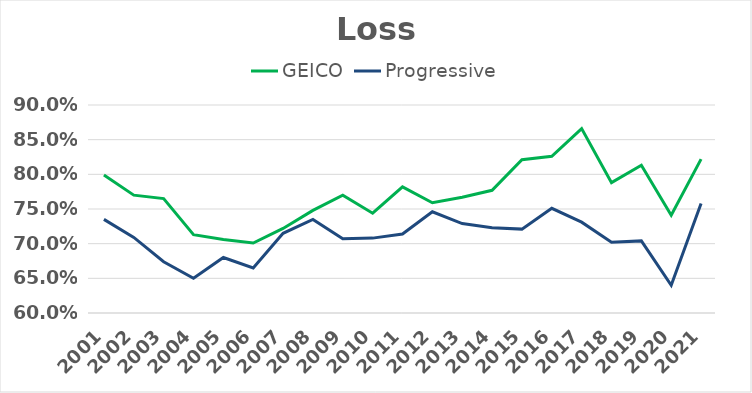
| Category | GEICO | Progressive |
|---|---|---|
| 2001.0 | 0.799 | 0.735 |
| 2002.0 | 0.77 | 0.709 |
| 2003.0 | 0.765 | 0.674 |
| 2004.0 | 0.713 | 0.65 |
| 2005.0 | 0.706 | 0.68 |
| 2006.0 | 0.701 | 0.665 |
| 2007.0 | 0.722 | 0.715 |
| 2008.0 | 0.748 | 0.735 |
| 2009.0 | 0.77 | 0.707 |
| 2010.0 | 0.744 | 0.708 |
| 2011.0 | 0.782 | 0.714 |
| 2012.0 | 0.759 | 0.746 |
| 2013.0 | 0.767 | 0.729 |
| 2014.0 | 0.777 | 0.723 |
| 2015.0 | 0.821 | 0.721 |
| 2016.0 | 0.826 | 0.751 |
| 2017.0 | 0.866 | 0.731 |
| 2018.0 | 0.788 | 0.702 |
| 2019.0 | 0.813 | 0.704 |
| 2020.0 | 0.741 | 0.64 |
| 2021.0 | 0.822 | 0.758 |